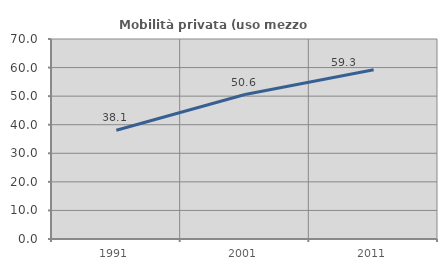
| Category | Mobilità privata (uso mezzo privato) |
|---|---|
| 1991.0 | 38.06 |
| 2001.0 | 50.552 |
| 2011.0 | 59.265 |